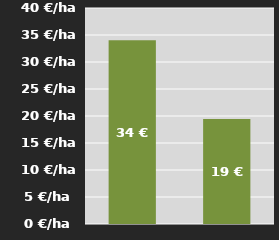
| Category | PSM |
|---|---|
| PSM | 34.02 |